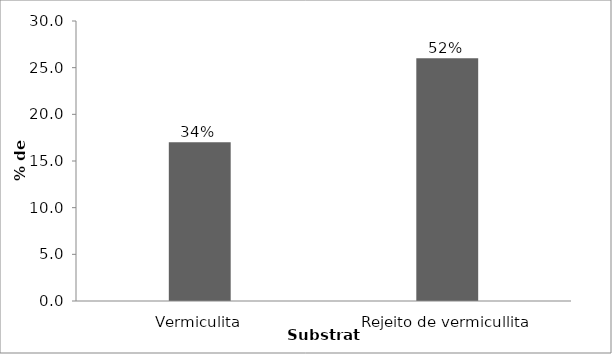
| Category | Series 0 |
|---|---|
| Vermiculita | 17 |
| Rejeito de vermicullita | 26 |